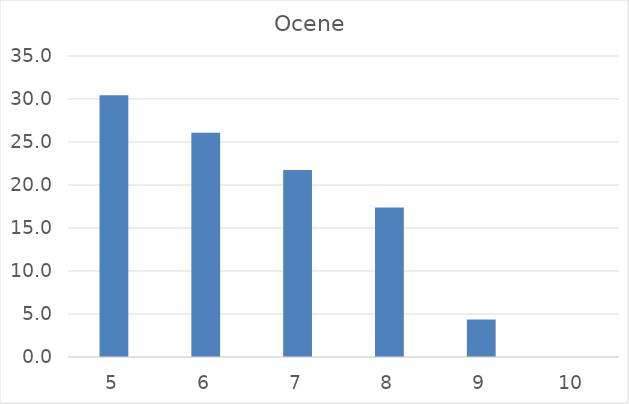
| Category | ОЦЕНЕ |
|---|---|
| 5.0 | 30.435 |
| 6.0 | 26.087 |
| 7.0 | 21.739 |
| 8.0 | 17.391 |
| 9.0 | 4.348 |
| 10.0 | 0 |